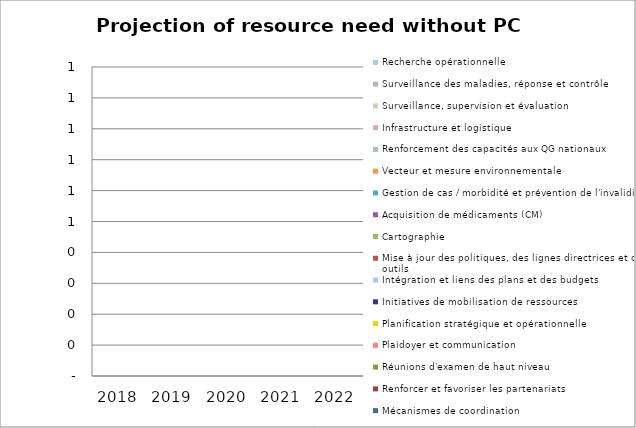
| Category | Mécanismes de coordination | Renforcer et favoriser les partenariats | Réunions d'examen de haut niveau | Plaidoyer et communication | Planification stratégique et opérationnelle | Initiatives de mobilisation de ressources | Intégration et liens des plans et des budgets | Mise à jour des politiques, des lignes directrices et des outils | Cartographie | Acquisition de médicaments (CM) | Gestion de cas / morbidité et prévention de l'invalidité | Vecteur et mesure environnementale | Renforcement des capacités aux QG nationaux | Infrastructure et logistique | Surveillance, supervision et évaluation | Surveillance des maladies, réponse et contrôle | Recherche opérationnelle |
|---|---|---|---|---|---|---|---|---|---|---|---|---|---|---|---|---|---|
| 2018 | 0 | 0 | 0 | 0 | 0 | 0 | 0 | 0 | 0 | 0 | 0 | 0 | 0 | 0 | 0 | 0 | 0 |
| 2019 | 0 | 0 | 0 | 0 | 0 | 0 | 0 | 0 | 0 | 0 | 0 | 0 | 0 | 0 | 0 | 0 | 0 |
| 2020 | 0 | 0 | 0 | 0 | 0 | 0 | 0 | 0 | 0 | 0 | 0 | 0 | 0 | 0 | 0 | 0 | 0 |
| 2021 | 0 | 0 | 0 | 0 | 0 | 0 | 0 | 0 | 0 | 0 | 0 | 0 | 0 | 0 | 0 | 0 | 0 |
| 2022 | 0 | 0 | 0 | 0 | 0 | 0 | 0 | 0 | 0 | 0 | 0 | 0 | 0 | 0 | 0 | 0 | 0 |